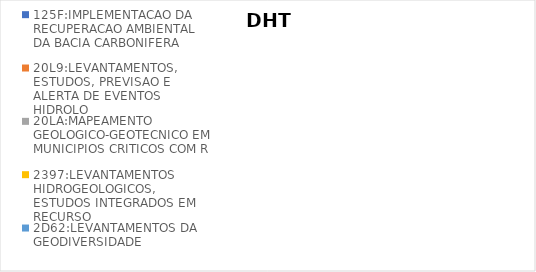
| Category | 125F:IMPLEMENTACAO DA RECUPERACAO AMBIENTAL DA BACIA CARBONIFERA | 20L9:LEVANTAMENTOS, ESTUDOS, PREVISAO E ALERTA DE EVENTOS HIDROLO | 20LA:MAPEAMENTO GEOLOGICO-GEOTECNICO EM MUNICIPIOS CRITICOS COM R | 2397:LEVANTAMENTOS HIDROGEOLOGICOS, ESTUDOS INTEGRADOS EM RECURSO | 2D62:LEVANTAMENTOS DA GEODIVERSIDADE |
|---|---|---|---|---|---|
| EXECUTADO | 0.07 | 0.043 | 0.127 | 0.174 | 0.162 |